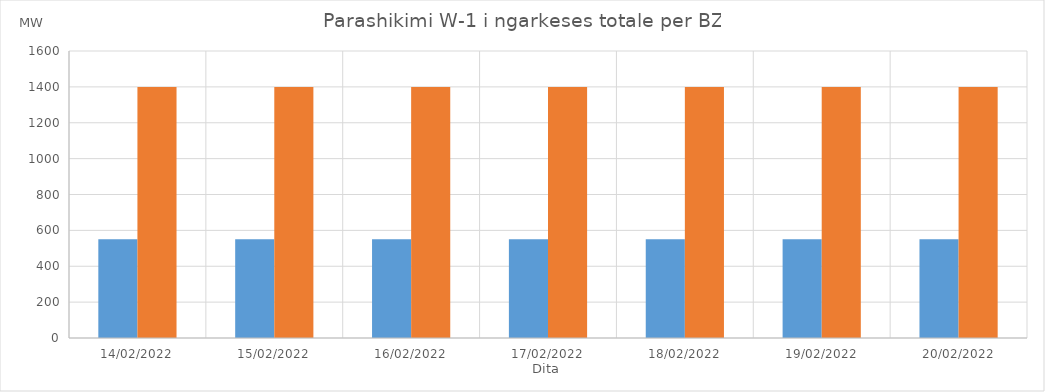
| Category | Min (MW) | Max (MW) |
|---|---|---|
| 14/02/2022 | 550 | 1400 |
| 15/02/2022 | 550 | 1400 |
| 16/02/2022 | 550 | 1400 |
| 17/02/2022 | 550 | 1400 |
| 18/02/2022 | 550 | 1400 |
| 19/02/2022 | 550 | 1400 |
| 20/02/2022 | 550 | 1400 |